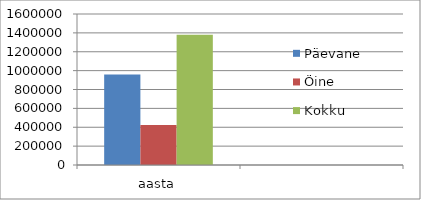
| Category | Päevane | Öine | Kokku |
|---|---|---|---|
| aasta | 958369.364 | 422633.857 | 1381003.221 |